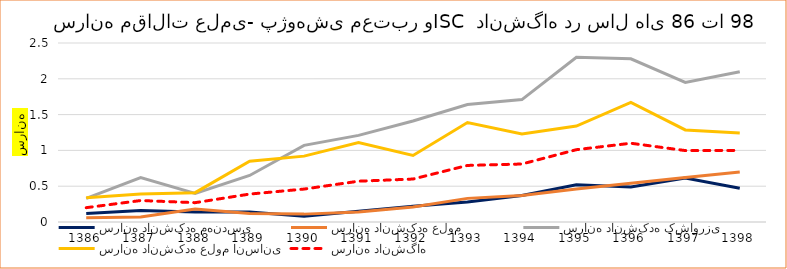
| Category | سرانه دانشکده مهندسی | سرانه دانشکده علوم | سرانه دانشکده کشاورزی | سرانه دانشکده علوم انسانی | سرانه دانشگاه |
|---|---|---|---|---|---|
| 1386.0 | 0.12 | 0.06 | 0.33 | 0.34 | 0.2 |
| 1387.0 | 0.16 | 0.07 | 0.62 | 0.39 | 0.3 |
| 1388.0 | 0.14 | 0.18 | 0.4 | 0.41 | 0.27 |
| 1389.0 | 0.14 | 0.12 | 0.65 | 0.85 | 0.39 |
| 1390.0 | 0.08 | 0.11 | 1.07 | 0.92 | 0.46 |
| 1391.0 | 0.15 | 0.14 | 1.21 | 1.11 | 0.57 |
| 1392.0 | 0.22 | 0.21 | 1.41 | 0.93 | 0.6 |
| 1393.0 | 0.28 | 0.33 | 1.64 | 1.39 | 0.79 |
| 1394.0 | 0.37 | 0.37 | 1.71 | 1.23 | 0.81 |
| 1395.0 | 0.52 | 0.46 | 2.3 | 1.34 | 1.01 |
| 1396.0 | 0.49 | 0.54 | 2.28 | 1.67 | 1.1 |
| 1397.0 | 0.615 | 0.621 | 1.949 | 1.286 | 0.998 |
| 1398.0 | 0.472 | 0.699 | 2.099 | 1.241 | 1 |